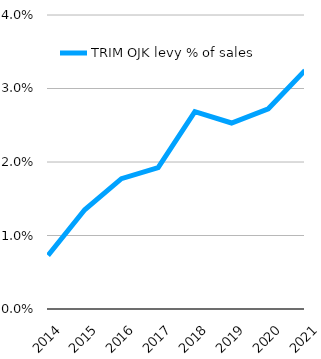
| Category | TRIM OJK levy % of sales |
|---|---|
| 2014 | 0.007 |
| 2015 | 0.013 |
| 2016 | 0.018 |
| 2017 | 0.019 |
| 2018 | 0.027 |
| 2019 | 0.025 |
| 2020 | 0.027 |
| 2021 | 0.032 |